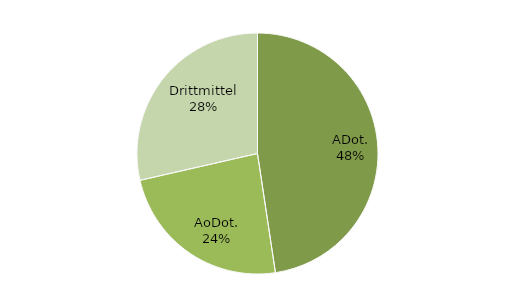
| Category | Series 0 |
|---|---|
| ADot. | 500000 |
| AoDot. | 250000 |
| Drittmittel | 300000 |